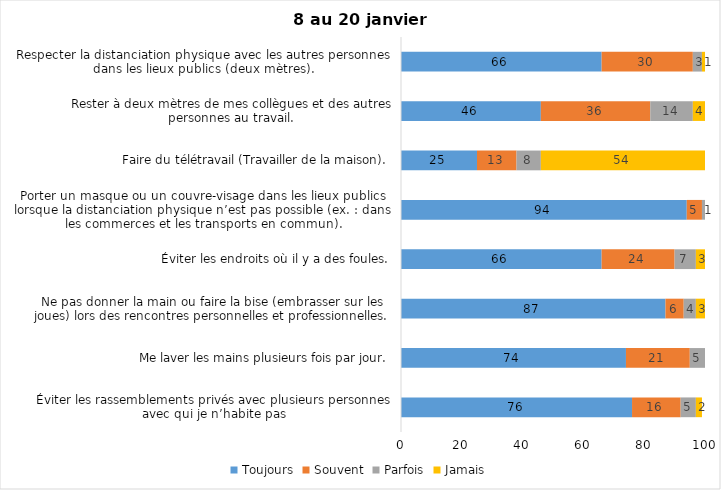
| Category | Toujours | Souvent | Parfois | Jamais |
|---|---|---|---|---|
| Éviter les rassemblements privés avec plusieurs personnes avec qui je n’habite pas | 76 | 16 | 5 | 2 |
| Me laver les mains plusieurs fois par jour. | 74 | 21 | 5 | 0 |
| Ne pas donner la main ou faire la bise (embrasser sur les joues) lors des rencontres personnelles et professionnelles. | 87 | 6 | 4 | 3 |
| Éviter les endroits où il y a des foules. | 66 | 24 | 7 | 3 |
| Porter un masque ou un couvre-visage dans les lieux publics lorsque la distanciation physique n’est pas possible (ex. : dans les commerces et les transports en commun). | 94 | 5 | 1 | 0 |
| Faire du télétravail (Travailler de la maison). | 25 | 13 | 8 | 54 |
| Rester à deux mètres de mes collègues et des autres personnes au travail. | 46 | 36 | 14 | 4 |
| Respecter la distanciation physique avec les autres personnes dans les lieux publics (deux mètres). | 66 | 30 | 3 | 1 |